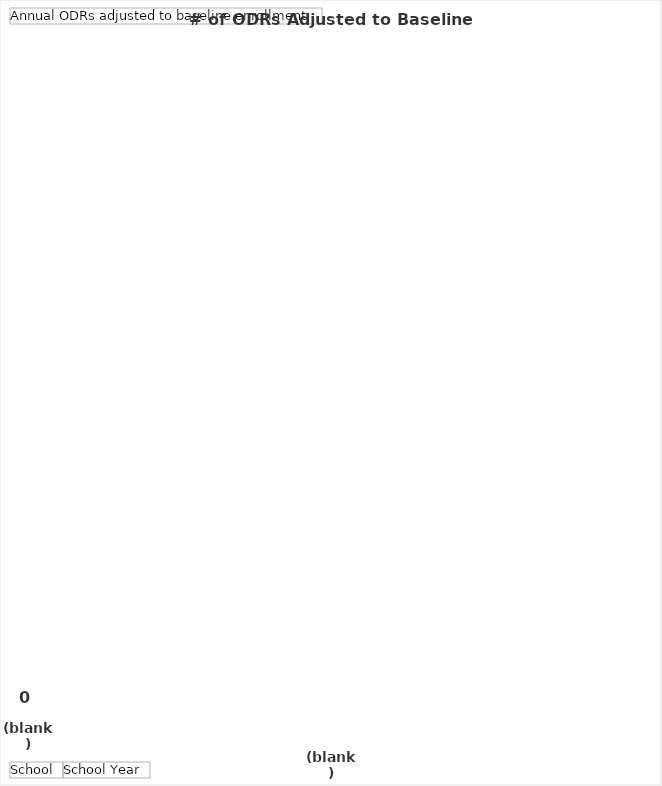
| Category | Total |
|---|---|
| 0 | 0 |